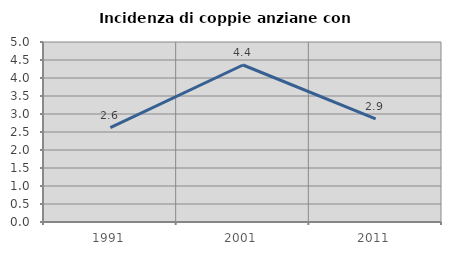
| Category | Incidenza di coppie anziane con figli |
|---|---|
| 1991.0 | 2.619 |
| 2001.0 | 4.361 |
| 2011.0 | 2.867 |